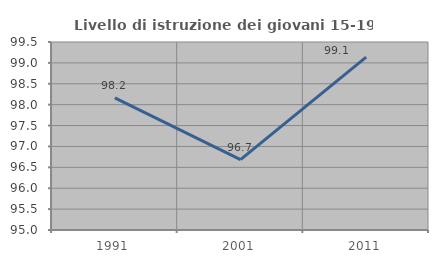
| Category | Livello di istruzione dei giovani 15-19 anni |
|---|---|
| 1991.0 | 98.162 |
| 2001.0 | 96.682 |
| 2011.0 | 99.138 |